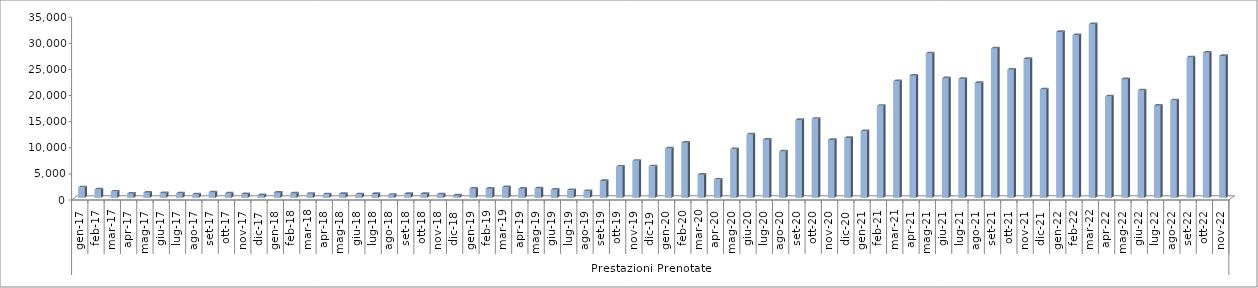
| Category | Series 0 |
|---|---|
| 0 | 2012 |
| 1900-01-01 | 1601 |
| 1900-01-02 | 1193 |
| 1900-01-03 | 796 |
| 1900-01-04 | 985 |
| 1900-01-05 | 883 |
| 1900-01-06 | 823 |
| 1900-01-07 | 648 |
| 1900-01-08 | 1028 |
| 1900-01-09 | 837 |
| 1900-01-10 | 693 |
| 1900-01-11 | 511 |
| 1900-01-12 | 996 |
| 1900-01-13 | 849 |
| 1900-01-14 | 765 |
| 1900-01-15 | 668 |
| 1900-01-16 | 737 |
| 1900-01-17 | 673 |
| 1900-01-18 | 732 |
| 1900-01-19 | 570 |
| 1900-01-20 | 752 |
| 1900-01-21 | 752 |
| 1900-01-22 | 648 |
| 1900-01-23 | 466 |
| 1900-01-24 | 1741 |
| 1900-01-25 | 1745 |
| 1900-01-26 | 2021 |
| 1900-01-27 | 1730 |
| 1900-01-28 | 1790 |
| 1900-01-29 | 1559 |
| 1900-01-30 | 1484 |
| 1900-01-31 | 1293 |
| 1900-02-01 | 3217 |
| 1900-02-02 | 5987 |
| 1900-02-03 | 7090 |
| 1900-02-04 | 6030 |
| 1900-02-05 | 9451 |
| 1900-02-06 | 10561 |
| 1900-02-07 | 4442 |
| 1900-02-08 | 3496 |
| 1900-02-09 | 9296 |
| 1900-02-10 | 12120 |
| 1900-02-11 | 11135 |
| 1900-02-12 | 8877 |
| 1900-02-13 | 14903 |
| 1900-02-14 | 15123 |
| 1900-02-15 | 11075 |
| 1900-02-16 | 11456 |
| 1900-02-17 | 12756 |
| 1900-02-18 | 17612 |
| 1900-02-19 | 22323 |
| 1900-02-20 | 23401 |
| 1900-02-21 | 27652 |
| 1900-02-22 | 22918 |
| 1900-02-23 | 22750 |
| 1900-02-24 | 21988 |
| 1900-02-25 | 28587 |
| 1900-02-26 | 24526 |
| 1900-02-27 | 26608 |
| 1900-02-28 | 20755 |
| 1900-02-28 | 31777 |
| 1900-03-01 | 31128 |
| 1900-03-02 | 33234 |
| 1900-03-03 | 19395 |
| 1900-03-04 | 22731 |
| 1900-03-05 | 20543 |
| 1900-03-06 | 17657 |
| 1900-03-07 | 18639 |
| 1900-03-08 | 26870 |
| 1900-03-09 | 27796 |
| 1900-03-10 | 27163 |